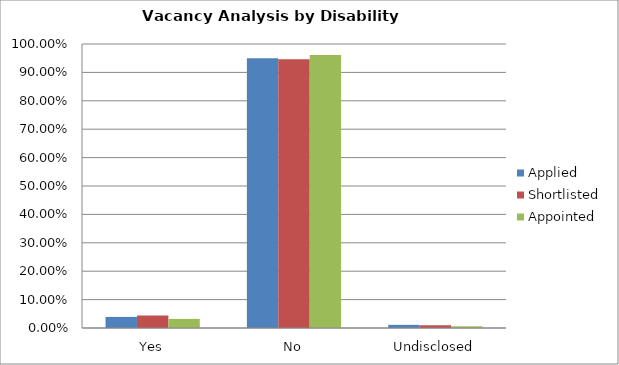
| Category | Applied | Shortlisted | Appointed |
|---|---|---|---|
| Yes | 0.039 | 0.044 | 0.032 |
| No | 0.95 | 0.946 | 0.961 |
| Undisclosed | 0.011 | 0.01 | 0.006 |